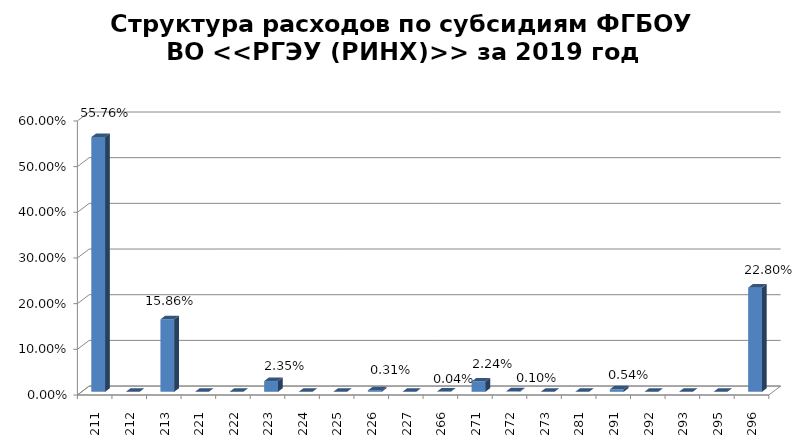
| Category | Series 0 |
|---|---|
|  211 | 0.558 |
|  212 | 0 |
|  213 | 0.159 |
|  221 | 0 |
|  222 | 0 |
|  223 | 0.023 |
|  224 | 0 |
|  225 | 0 |
|  226 | 0.003 |
| 227 | 0 |
| 266 | 0 |
| 271 | 0.022 |
| 272 | 0.001 |
| 273 | 0 |
| 281 | 0 |
| 291 | 0.005 |
| 292 | 0 |
| 293 | 0 |
| 295 | 0 |
| 296 | 0.228 |